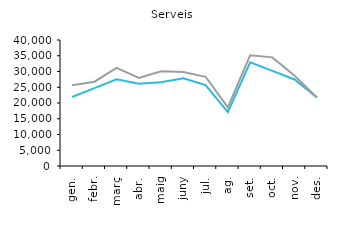
| Category | 2016 | 2017 |
|---|---|---|
| gen. | 21898 | 25639 |
| febr. | 24723 | 26756 |
| març | 27532 | 31155 |
| abr. | 26150 | 27976 |
| maig | 26614 | 30099 |
| juny | 27864 | 29871 |
| jul. | 25692 | 28322 |
| ag. | 17131 | 18595 |
| set. | 32912 | 35170 |
| oct. | 30204 | 34483 |
| nov. | 27475 | 28625 |
| des. | 21786 | 21721 |